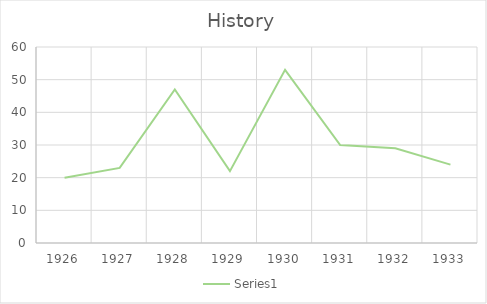
| Category | Series 0 |
|---|---|
| 1926.0 | 20 |
| 1927.0 | 23 |
| 1928.0 | 47 |
| 1929.0 | 22 |
| 1930.0 | 53 |
| 1931.0 | 30 |
| 1932.0 | 29 |
| 1933.0 | 24 |